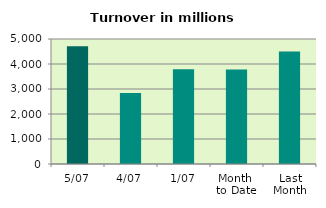
| Category | Series 0 |
|---|---|
| 5/07 | 4710.906 |
| 4/07 | 2837.813 |
| 1/07 | 3794.272 |
| Month 
to Date | 3780.997 |
| Last
Month | 4502.251 |